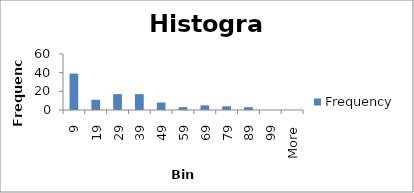
| Category | Frequency |
|---|---|
| 9 | 39 |
| 19 | 11 |
| 29 | 17 |
| 39 | 17 |
| 49 | 8 |
| 59 | 3 |
| 69 | 5 |
| 79 | 4 |
| 89 | 3 |
| 99 | 0 |
| More | 0 |